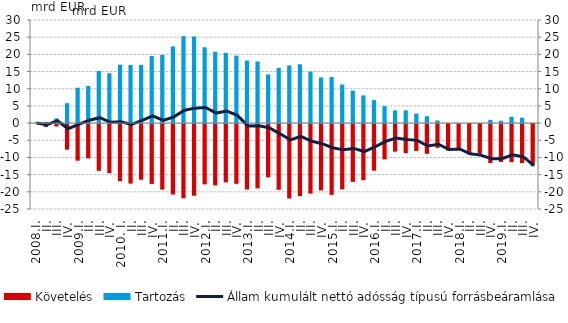
| Category | Követelés | Tartozás |
|---|---|---|
| 2008.I. | 0 | 0 |
| II. | -0.851 | 0.372 |
| III. | -0.698 | 1.388 |
| IV. | -7.444 | 5.798 |
| 2009.I. | -10.651 | 10.301 |
| II. | -9.986 | 10.798 |
| III. | -13.594 | 15.17 |
| IV. | -14.283 | 14.52 |
| 2010. I. | -16.613 | 17.005 |
| II. | -17.314 | 16.929 |
| III. | -16.185 | 16.948 |
| IV. | -17.416 | 19.527 |
| 2011.I. | -19.061 | 19.849 |
| II. | -20.485 | 22.309 |
| III. | -21.575 | 25.301 |
| IV. | -20.841 | 25.195 |
| 2012.I. | -17.539 | 22.066 |
| II. | -17.847 | 20.761 |
| III. | -16.951 | 20.433 |
| IV. | -17.379 | 19.629 |
| 2013.I. | -19.043 | 18.207 |
| II. | -18.703 | 17.929 |
| III. | -15.515 | 14.165 |
| IV. | -19.124 | 16.074 |
| 2014.I. | -21.656 | 16.791 |
| II. | -20.959 | 17.124 |
| III. | -20.221 | 14.972 |
| IV. | -19.295 | 13.303 |
| 2015.I. | -20.605 | 13.44 |
| II. | -19.008 | 11.22 |
| III. | -16.826 | 9.454 |
| IV. | -16.33 | 8.051 |
| 2016.I. | -13.559 | 6.668 |
| II. | -10.267 | 4.929 |
| III. | -8.014 | 3.69 |
| IV. | -8.453 | 3.701 |
| 2017.I. | -7.794 | 2.764 |
| II. | -8.64 | 1.985 |
| III. | -6.914 | 0.76 |
| IV. | -7.648 | -0.06 |
| 2018.I. | -7.549 | 0.022 |
| II. | -8.346 | -0.577 |
| III. | -8.72 | -0.601 |
| IV. | -11.312 | 0.947 |
| 2019.I. | -11.022 | 0.676 |
| II. | -11.079 | 1.832 |
| III. | -11.336 | 1.563 |
| IV. | -11.833 | -0.476 |